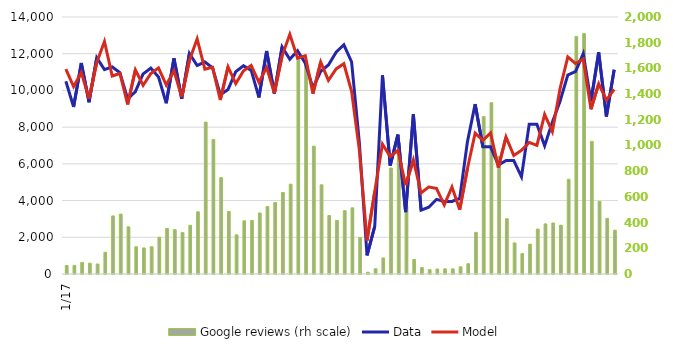
| Category | Google reviews (rh scale) |
|---|---|
| 2017-01-01 | 66 |
| 2017-02-01 | 67 |
| 2017-03-01 | 90 |
| 2017-04-01 | 84 |
| 2017-05-01 | 78 |
| 2017-06-01 | 169 |
| 2017-07-01 | 452 |
| 2017-08-01 | 466 |
| 2017-09-01 | 367 |
| 2017-10-01 | 212 |
| 2017-11-01 | 203 |
| 2017-12-01 | 212 |
| 2018-01-01 | 286 |
| 2018-02-01 | 355 |
| 2018-03-01 | 345 |
| 2018-04-01 | 322 |
| 2018-05-01 | 379 |
| 2018-06-01 | 484 |
| 2018-07-01 | 1182 |
| 2018-08-01 | 1047 |
| 2018-09-01 | 750 |
| 2018-10-01 | 486 |
| 2018-11-01 | 305 |
| 2018-12-01 | 414 |
| 2019-01-01 | 416 |
| 2019-02-01 | 475 |
| 2019-03-01 | 525 |
| 2019-04-01 | 556 |
| 2019-05-01 | 634 |
| 2019-06-01 | 699 |
| 2019-07-01 | 1689 |
| 2019-08-01 | 1631 |
| 2019-09-01 | 995 |
| 2019-10-01 | 694 |
| 2019-11-01 | 455 |
| 2019-12-01 | 417 |
| 2020-01-01 | 493 |
| 2020-02-01 | 515 |
| 2020-03-01 | 284 |
| 2020-04-01 | 14 |
| 2020-05-01 | 41 |
| 2020-06-01 | 125 |
| 2020-07-01 | 825 |
| 2020-08-01 | 1017 |
| 2020-09-01 | 527 |
| 2020-10-01 | 113 |
| 2020-11-01 | 50 |
| 2020-12-01 | 34 |
| 2021-01-01 | 39 |
| 2021-02-01 | 40 |
| 2021-03-01 | 40 |
| 2021-04-01 | 56 |
| 2021-05-01 | 80 |
| 2021-06-01 | 324 |
| 2021-07-01 | 1225 |
| 2021-08-01 | 1333 |
| 2021-09-01 | 915 |
| 2021-10-01 | 430 |
| 2021-11-01 | 242 |
| 2021-12-01 | 159 |
| 2022-01-01 | 232 |
| 2022-02-01 | 350 |
| 2022-03-01 | 390 |
| 2022-04-01 | 397 |
| 2022-05-01 | 380 |
| 2022-06-01 | 737 |
| 2022-07-01 | 1849 |
| 2022-08-01 | 1871 |
| 2022-09-01 | 1032 |
| 2022-10-01 | 565 |
| 2022-11-01 | 433 |
| 2022-12-01 | 341 |